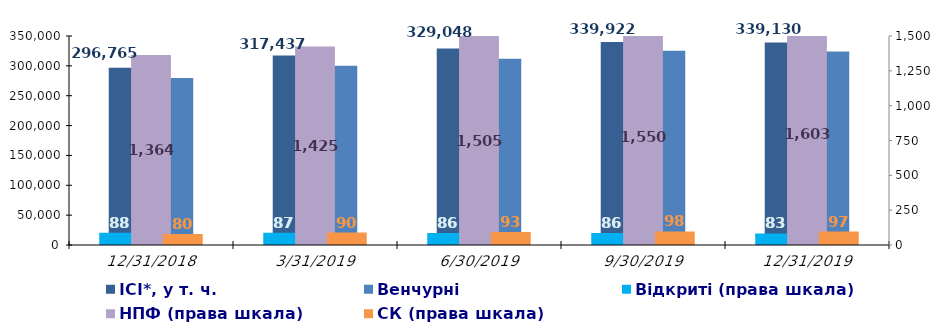
| Category | ІСІ*, у т. ч. | Венчурні |
|---|---|---|
| 12/31/18 | 296765.4 | 279713.3 |
| 3/31/19 | 317437.485 | 300241.731 |
| 6/30/19 | 329047.5 | 311811.9 |
| 9/30/19 | 339921.7 | 325109.9 |
| 12/31/19 | 339129.8 | 324105.005 |